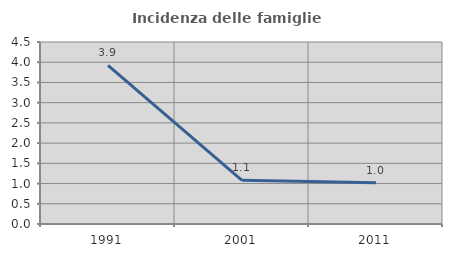
| Category | Incidenza delle famiglie numerose |
|---|---|
| 1991.0 | 3.922 |
| 2001.0 | 1.081 |
| 2011.0 | 1.018 |